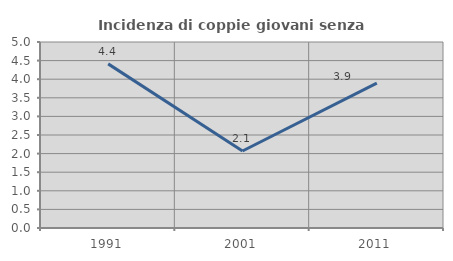
| Category | Incidenza di coppie giovani senza figli |
|---|---|
| 1991.0 | 4.412 |
| 2001.0 | 2.069 |
| 2011.0 | 3.896 |